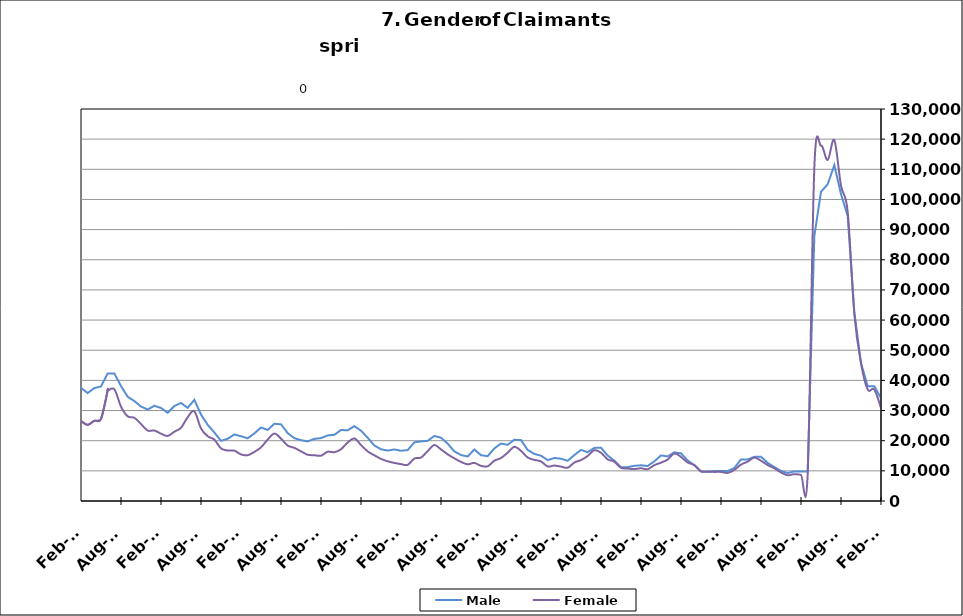
| Category | Male | Female |
|---|---|---|
| 1995-02-28 | 11910 | 7689 |
| 1995-03-31 | 12528 | 7887 |
| 1995-04-30 | 14119 | 8295 |
| 1995-05-31 | 15153 | 8659 |
| 1995-06-30 | 14654 | 9963 |
| 1995-07-31 | 16478 | 11435 |
| 1995-08-31 | 16264 | 11011 |
| 1995-09-30 | 13352 | 9104 |
| 1995-10-31 | 11499 | 8670 |
| 1995-11-30 | 10418 | 7960 |
| 1995-12-31 | 11010 | 7787 |
| 1996-01-31 | 11539 | 7863 |
| 1996-02-29 | 12768 | 7894 |
| 1996-03-31 | 13246 | 7755 |
| 1996-04-30 | 16021 | 8296 |
| 1996-05-31 | 15929 | 8751 |
| 1996-06-30 | 15291 | 10224 |
| 1996-07-31 | 17229 | 11535 |
| 1996-08-31 | 16317 | 10611 |
| 1996-09-30 | 13793 | 8812 |
| 1996-10-31 | 11431 | 8215 |
| 1996-11-30 | 10510 | 7751 |
| 1996-12-31 | 10023 | 7185 |
| 1997-01-31 | 12006 | 7404 |
| 1997-02-28 | 11976 | 7384 |
| 1997-03-31 | 11924 | 7078 |
| 1997-04-30 | 13098 | 7454 |
| 1997-05-31 | 13763 | 8032 |
| 1997-06-30 | 12872 | 9377 |
| 1997-07-31 | 15358 | 10550 |
| 1997-08-31 | 14888 | 9776 |
| 1997-09-30 | 12307 | 8016 |
| 1997-10-31 | 10749.5 | 7444 |
| 1997-11-30 | 9192 | 6872 |
| 1997-12-31 | 8541 | 6180 |
| 1998-01-31 | 9230 | 6563 |
| 1998-02-28 | 9286 | 6048 |
| 1998-03-31 | 9805 | 6012 |
| 1998-04-30 | 12254 | 7080 |
| 1998-05-31 | 13029 | 7509 |
| 1998-06-30 | 12376 | 9201 |
| 1998-07-31 | 14264 | 10448 |
| 1998-08-31 | 14319 | 9908 |
| 1998-09-30 | 12515 | 8202 |
| 1998-10-31 | 9927 | 7502 |
| 1998-11-30 | 9481 | 7563 |
| 1998-12-31 | 9422 | 7289 |
| 1999-01-31 | 10826 | 7829 |
| 1999-02-28 | 10614 | 7417 |
| 1999-03-31 | 10596 | 7180 |
| 1999-04-30 | 14139 | 8377 |
| 1999-05-31 | 14748 | 8508 |
| 1999-06-30 | 13399 | 9753 |
| 1999-07-31 | 16831 | 11294 |
| 1999-08-31 | 17466 | 10502 |
| 1999-09-30 | 14075 | 8356 |
| 1999-10-31 | 11344 | 7743 |
| 1999-11-30 | 10401 | 7623 |
| 1999-12-31 | 9702 | 6793 |
| 2000-01-31 | 10263 | 7252 |
| 2000-02-29 | 10217 | 7054 |
| 2000-03-31 | 10848 | 6860 |
| 2000-04-30 | 13099 | 8062 |
| 2000-05-31 | 13692 | 8388 |
| 2000-06-30 | 13498 | 10306 |
| 2000-07-31 | 15682 | 11874 |
| 2000-08-31 | 15407 | 10967 |
| 2000-09-30 | 12230 | 8808 |
| 2000-10-31 | 10182 | 8230 |
| 2000-11-30 | 9376 | 8049 |
| 2000-12-31 | 9229 | 7777 |
| 2001-01-31 | 10264 | 8400 |
| 2001-02-28 | 11709 | 8801 |
| 2001-03-31 | 9919 | 7036 |
| 2001-04-30 | 17255 | 11559 |
| 2001-05-31 | 18656 | 12219 |
| 2001-06-30 | 19590 | 15536 |
| 2001-07-31 | 22235 | 17388 |
| 2001-08-31 | 22550 | 16255 |
| 2001-09-30 | 20719 | 15193 |
| 2001-10-31 | 20761 | 15705 |
| 2001-11-30 | 22570 | 16084 |
| 2001-12-31 | 24429 | 16497 |
| 2002-01-31 | 26188 | 17125 |
| 2002-02-28 | 27071 | 16705 |
| 2002-03-31 | 26691 | 16475 |
| 2002-04-30 | 32125 | 20940 |
| 2002-05-31 | 31589 | 20115 |
| 2002-06-30 | 30220 | 21952 |
| 2002-07-31 | 30981 | 23132 |
| 2002-08-31 | 23858 | 16993 |
| 2002-09-30 | 27757 | 19832 |
| 2002-10-31 | 25023 | 18451 |
| 2002-11-30 | 24331 | 17763 |
| 2002-12-31 | 24361 | 17175 |
| 2003-01-31 | 24361 | 17175 |
| 2003-02-28 | 26133 | 17155 |
| 2003-03-31 | 26934 | 17491 |
| 2003-04-30 | 29393 | 19122 |
| 2003-05-31 | 30480 | 19811 |
| 2003-06-30 | 30177 | 22643 |
| 2003-07-31 | 30615 | 23565 |
| 2003-08-31 | 29860 | 22195 |
| 2003-09-30 | 26777 | 19925 |
| 2003-10-31 | 23899 | 18782 |
| 2003-11-30 | 22247 | 17944 |
| 2003-12-31 | 20902 | 16829 |
| 2004-01-31 | 20479 | 15794 |
| 2004-02-29 | 18869 | 14174 |
| 2004-03-31 | 18157 | 13452 |
| 2004-04-30 | 20525 | 14655 |
| 2004-05-31 | 20588 | 14975 |
| 2004-06-30 | 20148 | 17494 |
| 2004-07-31 | 22098 | 19064 |
| 2004-08-31 | 20778 | 16925 |
| 2004-09-30 | 17457 | 14258 |
| 2004-10-31 | 15548 | 13549 |
| 2004-11-30 | 14919 | 12836 |
| 2004-12-31 | 14200 | 11711 |
| 2005-01-31 | 14968 | 11918 |
| 2005-02-28 | 14478 | 11045 |
| 2005-03-31 | 13958 | 10426 |
| 2005-04-30 | 15898 | 11682 |
| 2005-05-31 | 16188 | 11900 |
| 2005-06-30 | 15549 | 14256 |
| 2005-07-31 | 16728 | 15274 |
| 2005-08-31 | 16418 | 13314 |
| 2005-09-30 | 12729 | 10857 |
| 2005-10-31 | 11493 | 10421 |
| 2005-11-30 | 10480 | 9638 |
| 2005-12-31 | 9482 | 8742 |
| 2006-01-31 | 9638 | 8761 |
| 2006-02-28 | 8844 | 7847 |
| 2006-03-31 | 9353 | 7709 |
| 2006-04-30 | 11916 | 9300 |
| 2006-05-31 | 12755 | 10017 |
| 2006-06-30 | 12840 | 12614 |
| 2006-07-31 | 14534 | 14007 |
| 2006-08-31 | 14510 | 12902 |
| 2006-09-30 | 12359 | 10850 |
| 2006-10-31 | 11360 | 10309 |
| 2006-11-30 | 10702 | 9403 |
| 2006-12-31 | 10886 | 9298 |
| 2007-01-31 | 11619 | 9539 |
| 2007-02-28 | 12137 | 9112 |
| 2007-03-31 | 12434 | 9125 |
| 2007-04-30 | 14864 | 10520 |
| 2007-05-31 | 16656 | 11730 |
| 2007-06-30 | 16711 | 14024 |
| 2007-07-31 | 18458 | 15882 |
| 2007-08-31 | 17879 | 14187 |
| 2007-09-30 | 16538 | 13586 |
| 2007-10-31 | 15458 | 13070 |
| 2007-11-15 | 14626 | 12172 |
| 2007-12-15 09:36:00 | 15625 | 12363 |
| 2008-01-14 19:12:00 | 17236 | 12936 |
| 2008-02-14 04:48:00 | 18262 | 12696 |
| 2008-03-15 14:24:00 | 19119 | 13263 |
| 2008-04-15 | 22039 | 15054 |
| 2008-05-15 09:36:00 | 24402 | 16733 |
| 2008-06-14 19:12:00 | 25155 | 19969 |
| 2008-07-15 04:48:00 | 27499 | 22268 |
| 2008-08-14 14:24:00 | 29286 | 21514 |
| 2008-09-14 | 30571 | 21776 |
| 2008-10-14 09:36:00 | 32282 | 22190 |
| 2008-11-13 19:12:00 | 36325 | 23395 |
| 2008-12-14 04:48:00 | 42012 | 25046 |
| 2009-01-13 14:24:00 | 49131 | 27148 |
| 2009-02-13 | 56509 | 29774 |
| 2009-03-15 09:36:00 | 63334 | 33788 |
| 2009-04-14 19:12:00 | 69062 | 36842 |
| 2009-05-15 04:48:00 | 69914 | 37773 |
| 2009-06-14 14:24:00 | 69512 | 42787 |
| 2009-07-15 | 71226 | 46347 |
| 2009-08-14 09:36:00 | 68777 | 43130 |
| 2009-09-13 19:12:00 | 65993 | 41526 |
| 2009-10-14 04:48:00 | 62480 | 40217 |
| 2009-11-13 14:24:00 | 60354 | 38454 |
| 2009-12-14 | 59507 | 36101 |
| 2010-01-13 09:36:00 | 58501 | 35014 |
| 2010-02-12 19:12:00 | 55590 | 32911 |
| 2010-03-15 04:48:00 | 53238 | 31883 |
| 2010-04-14 14:24:00 | 52264 | 32995 |
| 2010-05-15 | 50301 | 32394 |
| 2010-06-14 09:36:00 | 48130 | 36605 |
| 2010-07-14 19:12:00 | 48060 | 38748 |
| 2010-08-14 04:48:00 | 46311 | 35599 |
| 2010-09-13 14:24:00 | 41641 | 32453 |
| 2010-10-14 | 40403 | 32335 |
| 2010-11-13 09:36:00 | 38250 | 30275 |
| 2010-12-13 19:12:00 | 35858 | 26887 |
| 2011-01-13 04:48:00 | 37777 | 27522 |
| 2011-02-12 14:24:00 | 37515 | 26470 |
| 2011-03-15 | 35802 | 25248 |
| 2011-04-14 09:36:00 | 37452 | 26608 |
| 2011-05-14 19:12:00 | 37975 | 27212 |
| 2011-06-14 04:48:00 | 42289 | 36578 |
| 2011-07-14 14:24:00 | 42307 | 37061 |
| 2011-08-14 | 38125 | 31317 |
| 2011-09-13 09:36:00 | 34564 | 28090 |
| 2011-10-13 19:12:00 | 33146 | 27591 |
| 2011-11-13 04:48:00 | 31337 | 25538 |
| 2011-12-13 14:24:00 | 30334 | 23349 |
| 2012-01-13 | 31566 | 23385 |
| 2012-02-12 09:36:00 | 30859 | 22326 |
| 2012-03-13 19:12:00 | 29261 | 21568 |
| 2012-04-13 04:48:00 | 31494 | 22964 |
| 2012-05-13 14:24:00 | 32509 | 24284 |
| 2012-06-13 | 30900 | 27768 |
| 2012-07-13 09:36:00 | 33549 | 29756 |
| 2012-08-12 19:12:00 | 28663 | 24059 |
| 2012-09-12 04:48:00 | 25271 | 21482 |
| 2012-10-12 14:24:00 | 22730 | 20363 |
| 2012-11-12 | 19953 | 17450 |
| 2012-12-12 09:36:00 | 20635 | 16737 |
| 2013-01-11 19:12:00 | 22057 | 16712 |
| 2013-02-11 04:48:00 | 21486 | 15451 |
| 2013-03-13 14:24:00 | 20791 | 15186 |
| 2013-04-13 | 22409 | 16286 |
| 2013-05-13 09:36:00 | 24366 | 17794 |
| 2013-06-12 19:12:00 | 23573 | 20360 |
| 2013-07-13 04:48:00 | 25613 | 22369 |
| 2013-08-12 14:24:00 | 25420 | 20697 |
| 2013-09-12 | 22525 | 18385 |
| 2013-10-12 09:36:00 | 20848 | 17632 |
| 2013-11-11 19:12:00 | 20174 | 16466 |
| 2013-12-12 04:48:00 | 19765 | 15343 |
| 2014-01-11 14:24:00 | 20604 | 15183 |
| 2014-02-11 | 20864 | 15026 |
| 2014-03-13 09:36:00 | 21751 | 16343 |
| 2014-04-12 19:12:00 | 21948 | 16190 |
| 2014-05-13 04:48:00 | 23554 | 17163 |
| 2014-06-12 14:24:00 | 23446 | 19393 |
| 2014-07-13 | 24827 | 20751 |
| 2014-08-14 | 23315 | 18575 |
| 2014-09-13 09:36:00 | 20988 | 16453 |
| 2014-10-13 19:12:00 | 18411 | 15157 |
| 2014-11-13 04:48:00 | 17155 | 13975 |
| 2014-12-13 14:24:00 | 16727 | 13162 |
| 2015-01-13 | 17097 | 12633 |
| 2015-02-12 09:36:00 | 16674 | 12222 |
| 2015-03-14 19:12:00 | 16878 | 11988 |
| 2015-04-14 04:48:00 | 19448 | 14078 |
| 2015-05-14 14:24:00 | 19759 | 14413 |
| 2015-06-14 | 19952 | 16548 |
| 2015-07-14 09:36:00 | 21569 | 18572 |
| 2015-08-13 19:12:00 | 21001 | 17106 |
| 2015-09-13 04:48:00 | 19028 | 15475 |
| 2015-10-13 14:24:00 | 16459 | 14160 |
| 2015-11-13 | 15246 | 12968 |
| 2015-12-13 09:36:00 | 14756 | 12166 |
| 2016-01-12 19:12:00 | 17097 | 12633 |
| 2016-02-12 04:48:00 | 15198 | 11659 |
| 2016-03-13 14:24:00 | 14862 | 11506 |
| 2016-04-13 | 17432 | 13364 |
| 2016-05-13 09:36:00 | 19040 | 14264 |
| 2016-06-12 19:12:00 | 18628 | 16024 |
| 2016-07-13 04:48:00 | 20305 | 17959 |
| 2016-08-12 14:24:00 | 20204 | 16625 |
| 2016-09-12 | 16946 | 14443 |
| 2016-10-12 09:36:00 | 15612 | 13624 |
| 2016-11-11 19:12:00 | 15023 | 13122 |
| 2016-12-12 04:48:00 | 13560 | 11454 |
| 2017-01-11 14:24:00 | 14257 | 11754 |
| 2017-02-11 | 14028 | 11405 |
| 2017-03-13 09:36:00 | 13342 | 11038 |
| 2017-04-12 19:12:00 | 15225 | 12749 |
| 2017-05-13 04:48:00 | 16938 | 13582 |
| 2017-06-12 14:24:00 | 16188 | 14911 |
| 2017-07-13 | 17613 | 16845 |
| 2017-08-12 09:36:00 | 17640 | 16005 |
| 2017-09-11 19:12:00 | 15075 | 13806 |
| 2017-10-12 04:48:00 | 13384 | 13044 |
| 2017-11-11 14:24:00 | 11160 | 11015 |
| 2017-12-12 | 11238 | 10767 |
| 2018-01-11 09:36:00 | 11674 | 10594 |
| 2018-02-10 19:12:00 | 11835 | 10845 |
| 2018-03-13 04:48:00 | 11605 | 10548 |
| 2018-04-12 14:24:00 | 13162 | 11886 |
| 2018-05-13 | 15110 | 12712 |
| 2018-06-12 09:36:00 | 14782 | 13754 |
| 2018-07-12 19:12:00 | 16123 | 15773 |
| 2018-08-12 04:48:00 | 15808 | 14614 |
| 2018-09-11 14:24:00 | 13450 | 12761 |
| 2018-10-12 | 11831 | 11941 |
| 2018-11-11 09:36:00 | 9820 | 9821 |
| 2018-12-11 19:12:00 | 9649 | 9767 |
| 2019-01-11 04:48:00 | 9933 | 9654 |
| 2019-02-10 14:24:00 | 9925 | 9651 |
| 2019-03-13 | 9922 | 9318 |
| 2019-04-12 09:36:00 | 10950 | 10320 |
| 2019-05-12 19:12:00 | 13782 | 12072 |
| 2019-06-12 04:48:00 | 13767 | 13063 |
| 2019-07-12 14:24:00 | 14644 | 14409 |
| 2019-08-12 | 14678 | 13343 |
| 2019-09-11 09:36:00 | 12637 | 11915 |
| 2019-10-11 19:12:00 | 11254 | 10847 |
| 2019-11-11 04:48:00 | 9954 | 9467 |
| 2019-12-11 14:24:00 | 9289 | 8549 |
| 2020-01-11 | 9815 | 8911 |
| 2020-02-10 09:36:00 | 9754 | 8723 |
| 2020-03-11 19:12:00 | 9805 | 8802 |
| 2020-04-11 04:48:00 | 87837 | 110534 |
| 2020-05-11 14:24:00 | 102538 | 117856 |
| 2020-06-11 | 105039 | 113108 |
| 2020-07-11 09:36:00 | 111386 | 119644 |
| 2020-08-10 19:12:00 | 101758 | 104593 |
| 2020-09-10 04:48:00 | 94558 | 95979 |
| 2020-10-10 14:24:00 | 62680 | 62005 |
| 2020-11-10 | 45770 | 45707 |
| 2020-12-10 09:36:00 | 38071 | 36983 |
| 2021-01-09 19:12:00 | 38071 | 36983 |
| 2021-02-09 04:48:00 | 34126 | 30845 |